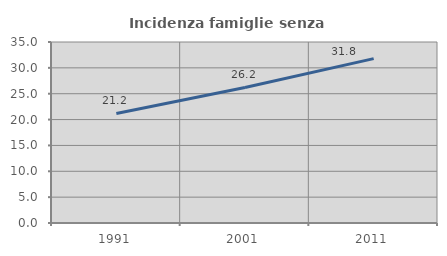
| Category | Incidenza famiglie senza nuclei |
|---|---|
| 1991.0 | 21.179 |
| 2001.0 | 26.214 |
| 2011.0 | 31.784 |